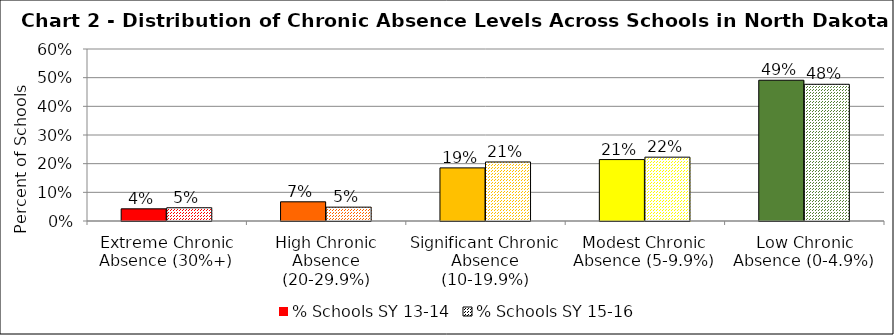
| Category | % Schools SY 13-14 | % Schools SY 15-16 |
|---|---|---|
| Extreme Chronic Absence (30%+) | 0.042 | 0.046 |
| High Chronic Absence (20-29.9%) | 0.067 | 0.048 |
| Significant Chronic Absence (10-19.9%) | 0.185 | 0.206 |
| Modest Chronic Absence (5-9.9%) | 0.214 | 0.223 |
| Low Chronic Absence (0-4.9%) | 0.491 | 0.477 |